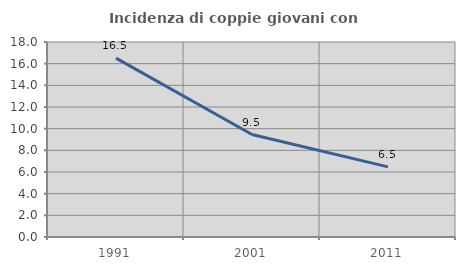
| Category | Incidenza di coppie giovani con figli |
|---|---|
| 1991.0 | 16.51 |
| 2001.0 | 9.456 |
| 2011.0 | 6.472 |